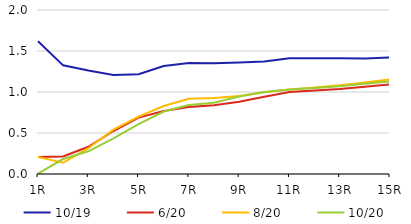
| Category | 10/19 | 6/20 | 8/20 | 10/20 |
|---|---|---|---|---|
|  1R | 1.618 | 0.208 | 0.208 | 0.005 |
|  2R | 1.325 | 0.213 | 0.137 | 0.183 |
|  3R | 1.262 | 0.332 | 0.314 | 0.277 |
|  4R | 1.208 | 0.524 | 0.54 | 0.436 |
|  5R | 1.216 | 0.687 | 0.701 | 0.608 |
|  6R | 1.316 | 0.769 | 0.829 | 0.762 |
|  7R | 1.353 | 0.817 | 0.917 | 0.842 |
|  8R | 1.35 | 0.839 | 0.927 | 0.868 |
|  9R | 1.36 | 0.882 | 0.951 | 0.944 |
|  10R | 1.373 | 0.942 | 0.996 | 1 |
|  11R | 1.411 | 1 | 1.031 | 1.03 |
|  12R | 1.411 | 1.018 | 1.056 | 1.05 |
|  13R | 1.41 | 1.036 | 1.081 | 1.07 |
|  14R | 1.41 | 1.063 | 1.117 | 1.1 |
|  15R | 1.421 | 1.094 | 1.155 | 1.13 |